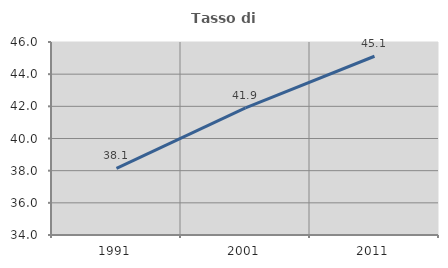
| Category | Tasso di occupazione   |
|---|---|
| 1991.0 | 38.137 |
| 2001.0 | 41.901 |
| 2011.0 | 45.114 |